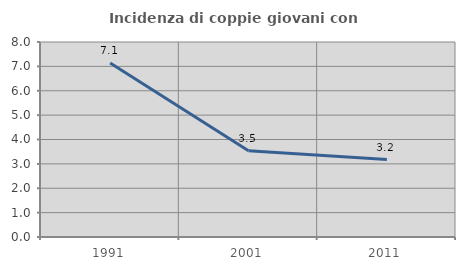
| Category | Incidenza di coppie giovani con figli |
|---|---|
| 1991.0 | 7.143 |
| 2001.0 | 3.54 |
| 2011.0 | 3.175 |